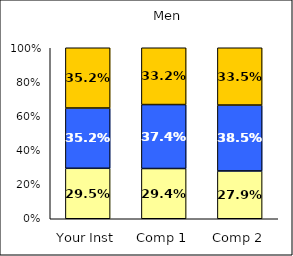
| Category | Low Satisfaction with Coursework | Average Satisfaction with Coursework | High Satisfaction with Coursework |
|---|---|---|---|
| Your Inst | 0.295 | 0.352 | 0.352 |
| Comp 1 | 0.294 | 0.374 | 0.332 |
| Comp 2 | 0.279 | 0.385 | 0.335 |